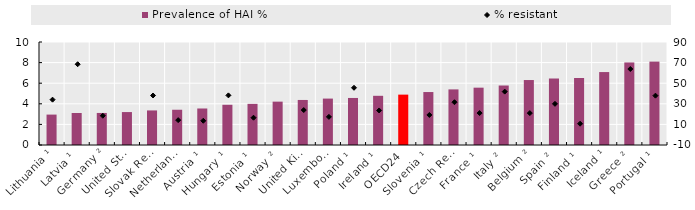
| Category | Prevalence of HAI % |
|---|---|
| Lithuania ¹ | 2.953 |
| Latvia ¹ | 3.109 |
| Germany ² | 3.111 |
| United States ² | 3.198 |
| Slovak Republic ¹ | 3.356 |
| Netherlands ¹ | 3.423 |
| Austria ¹ | 3.545 |
| Hungary ¹ | 3.905 |
| Estonia ¹ | 3.995 |
| Norway ² | 4.21 |
| United Kingdom ¹ | 4.373 |
| Luxembourg ² | 4.506 |
| Poland ¹ | 4.566 |
| Ireland ¹ | 4.776 |
| OECD24 | 4.89 |
| Slovenia ¹ | 5.142 |
| Czech Republic ² | 5.398 |
| France ¹ | 5.566 |
| Italy ² | 5.776 |
| Belgium ² | 6.307 |
| Spain ² | 6.456 |
| Finland ¹ | 6.504 |
| Iceland ¹ | 7.082 |
| Greece ² | 8.014 |
| Portugal ¹ | 8.096 |